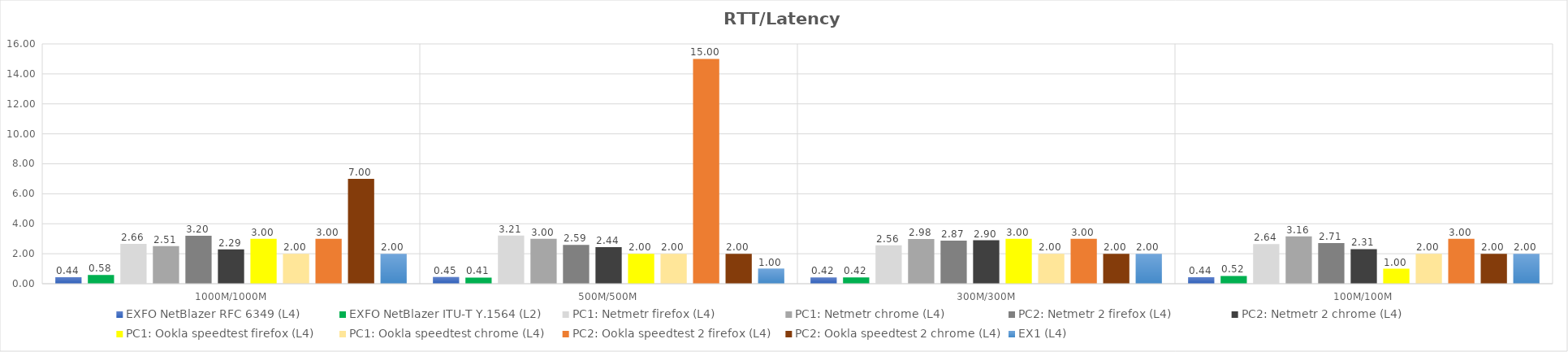
| Category | EXFO NetBlazer RFC 6349 (L4) | EXFO NetBlazer ITU-T Y.1564 (L2) | PC1: Netmetr firefox (L4) | PC1: Netmetr chrome (L4) | PC2: Netmetr 2 firefox (L4) | PC2: Netmetr 2 chrome (L4) | PC1: Ookla speedtest firefox (L4) | PC1: Ookla speedtest chrome (L4) | PC2: Ookla speedtest 2 firefox (L4) | PC2: Ookla speedtest 2 chrome (L4) | EX1 (L4) | Series 6 |
|---|---|---|---|---|---|---|---|---|---|---|---|---|
| 1000M/1000M | 0.438 | 0.58 | 2.66 | 2.51 | 3.2 | 2.29 | 3 | 2 | 3 | 7 | 2 |  |
| 500M/500M | 0.446 | 0.41 | 3.21 | 3 | 2.59 | 2.44 | 2 | 2 | 15 | 2 | 1 |  |
| 300M/300M | 0.42 | 0.424 | 2.56 | 2.98 | 2.87 | 2.9 | 3 | 2 | 3 | 2 | 2 |  |
| 100M/100M | 0.439 | 0.52 | 2.64 | 3.16 | 2.71 | 2.31 | 1 | 2 | 3 | 2 | 2 |  |